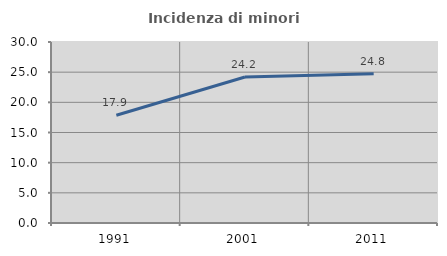
| Category | Incidenza di minori stranieri |
|---|---|
| 1991.0 | 17.857 |
| 2001.0 | 24.19 |
| 2011.0 | 24.757 |